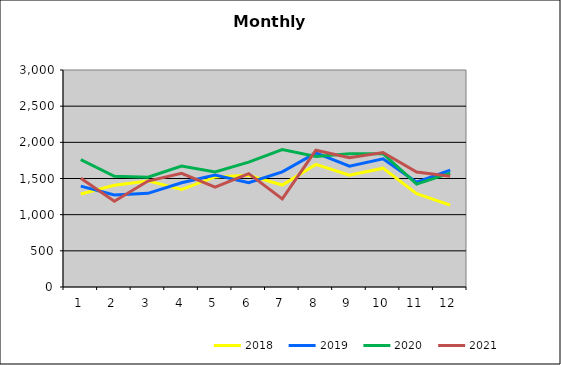
| Category | 2018 | 2019 | 2020 | 2021 |
|---|---|---|---|---|
| 0 | 1286.21 | 1394.576 | 1762.064 | 1503.68 |
| 1 | 1406.556 | 1272.617 | 1530.829 | 1186.293 |
| 2 | 1466.695 | 1295.231 | 1518.163 | 1464.516 |
| 3 | 1347.408 | 1441.267 | 1671.58 | 1572.076 |
| 4 | 1522.181 | 1548.691 | 1589.128 | 1381.3 |
| 5 | 1543.945 | 1443.46 | 1725.706 | 1567.527 |
| 6 | 1409.491 | 1591.615 | 1898.774 | 1216.971 |
| 7 | 1694.901 | 1854.799 | 1803.166 | 1890.51 |
| 8 | 1545.104 | 1671.028 | 1843.578 | 1786.553 |
| 9 | 1642.816 | 1771.378 | 1843.468 | 1860.206 |
| 10 | 1288.934 | 1448.517 | 1422.612 | 1589.001 |
| 11 | 1131.485 | 1616.657 | 1574.354 | 1532.413 |